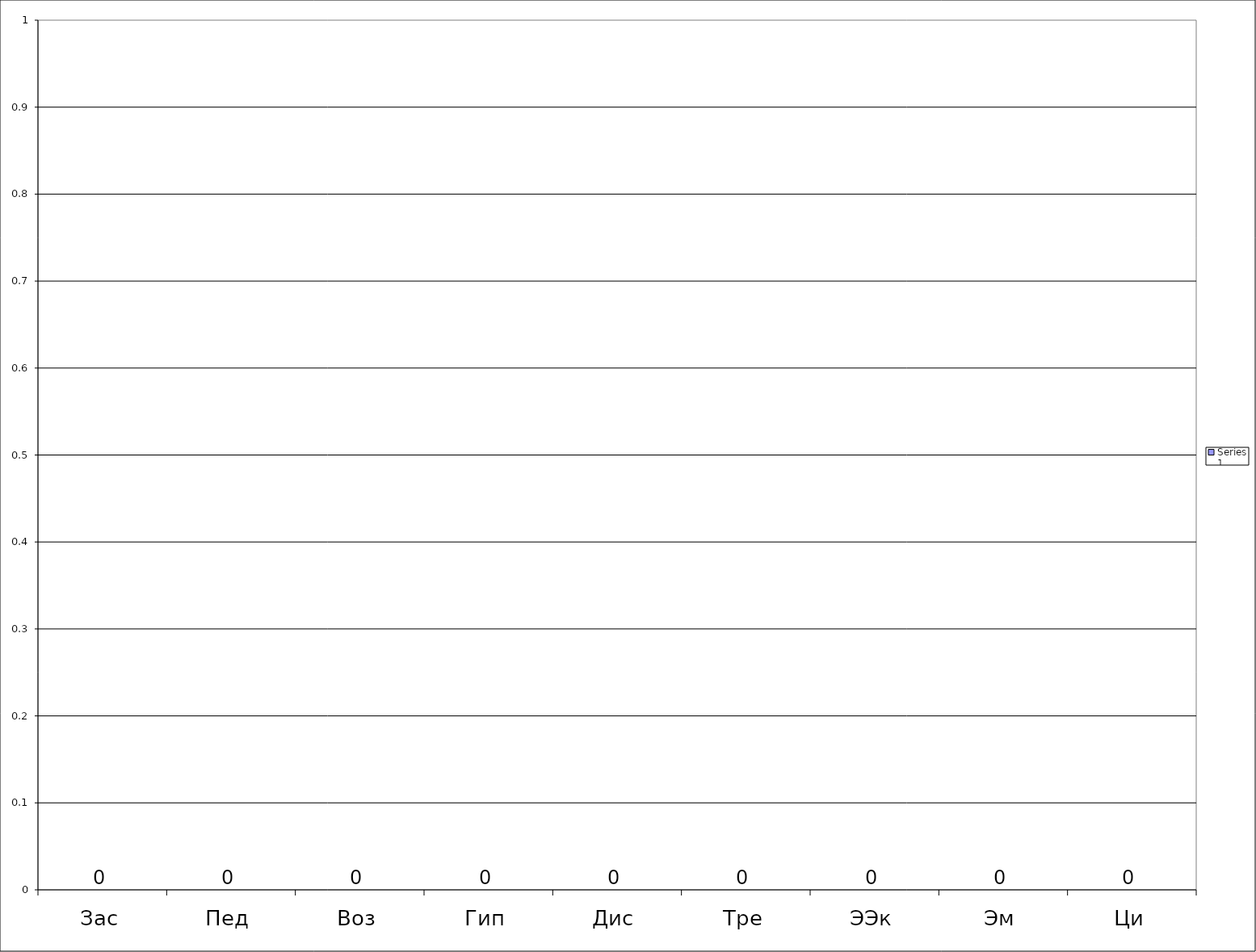
| Category | Series 0 |
|---|---|
| Зас | 0 |
| Пед | 0 |
| Воз | 0 |
| Гип | 0 |
| Дис | 0 |
| Тре | 0 |
| ЭЭк | 0 |
| Эм | 0 |
| Ци | 0 |